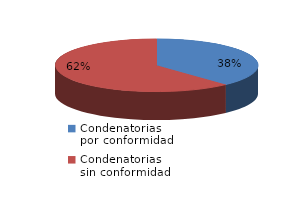
| Category | Series 0 |
|---|---|
| 0 | 419 |
| 1 | 681 |